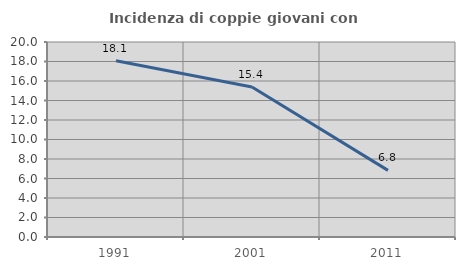
| Category | Incidenza di coppie giovani con figli |
|---|---|
| 1991.0 | 18.072 |
| 2001.0 | 15.385 |
| 2011.0 | 6.832 |